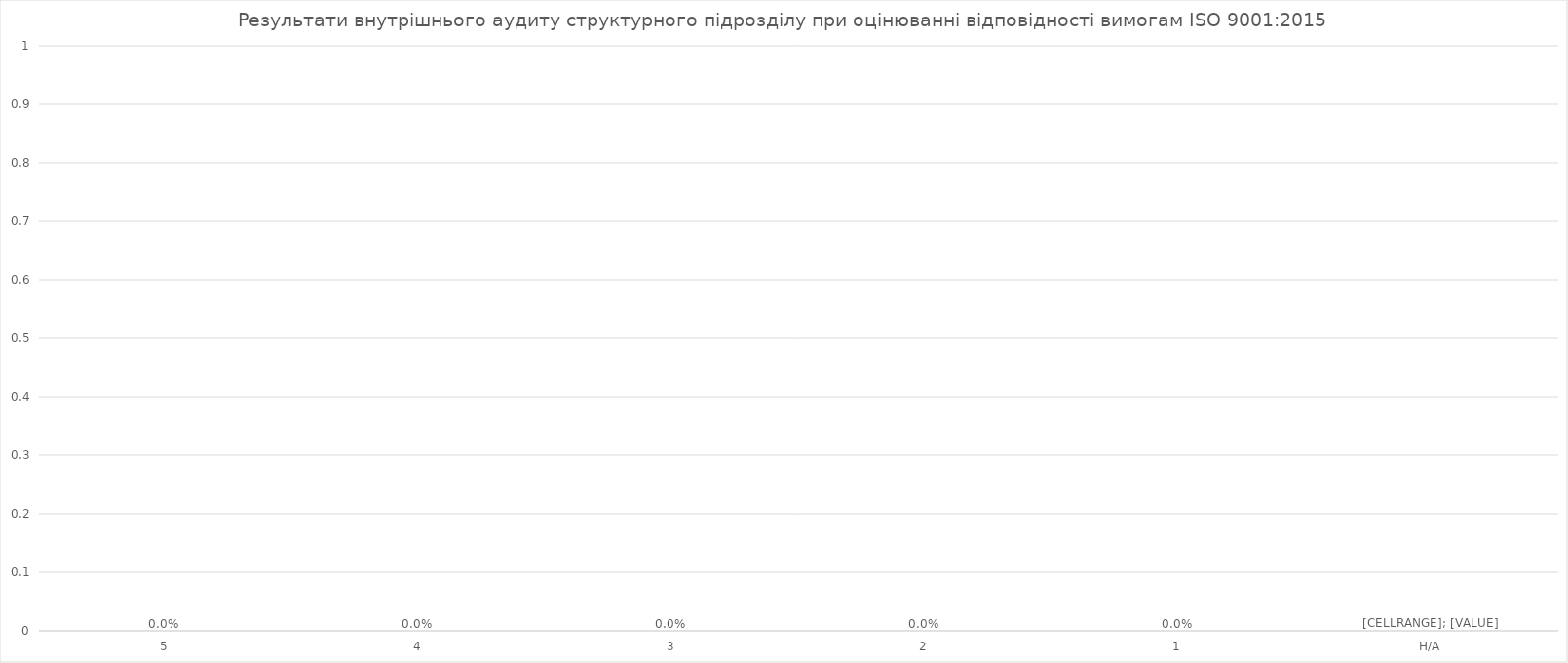
| Category | Кількість оцінок |
|---|---|
| 5 | 0 |
| 4 | 0 |
| 3 | 0 |
| 2 | 0 |
| 1 | 0 |
| Н/А | 0 |